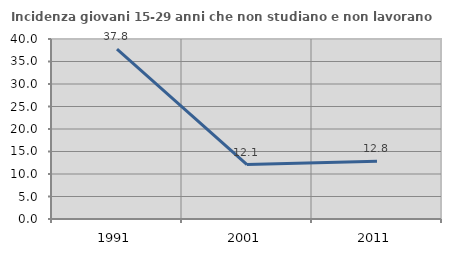
| Category | Incidenza giovani 15-29 anni che non studiano e non lavorano  |
|---|---|
| 1991.0 | 37.766 |
| 2001.0 | 12.097 |
| 2011.0 | 12.81 |